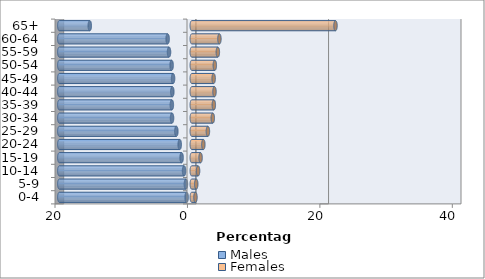
| Category | Males | Females |
|---|---|---|
| 0-4 | -0.778 | 0.555 |
| 5-9 | -0.886 | 0.672 |
| 10-14 | -1.164 | 0.95 |
| 15-19 | -1.537 | 1.328 |
| 20-24 | -1.82 | 1.748 |
| 25-29 | -2.329 | 2.434 |
| 30-34 | -2.982 | 3.174 |
| 35-39 | -3.009 | 3.328 |
| 40-44 | -2.938 | 3.428 |
| 45-49 | -2.824 | 3.303 |
| 50-54 | -3.044 | 3.478 |
| 55-59 | -3.437 | 3.935 |
| 60-64 | -3.645 | 4.173 |
| 65+ | -15.402 | 21.702 |